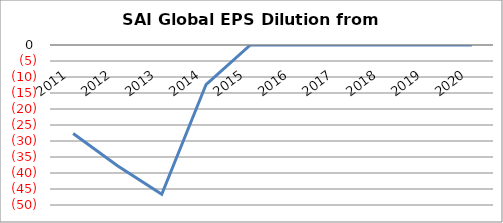
| Category | SAI Global EPS Dilution from Transaction |
|---|---|
| 2011.0 | -27.677 |
| 2012.0 | -37.718 |
| 2013.0 | -46.679 |
| 2014.0 | -12.362 |
| 2015.0 | 0 |
| 2016.0 | 0 |
| 2017.0 | 0 |
| 2018.0 | 0 |
| 2019.0 | 0 |
| 2020.0 | 0 |